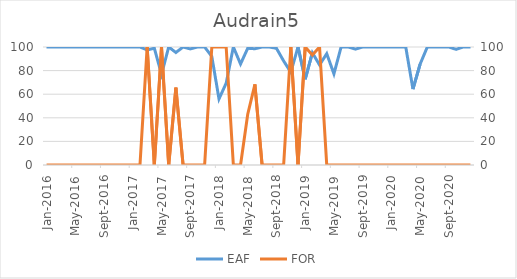
| Category | EAF |
|---|---|
| 2016-01-01 | 100 |
| 2016-02-01 | 100 |
| 2016-03-01 | 100 |
| 2016-04-01 | 100 |
| 2016-05-01 | 100 |
| 2016-06-01 | 100 |
| 2016-07-01 | 100 |
| 2016-08-01 | 100 |
| 2016-09-01 | 100 |
| 2016-10-01 | 100 |
| 2016-11-01 | 100 |
| 2016-12-01 | 100 |
| 2017-01-01 | 100 |
| 2017-02-01 | 100 |
| 2017-03-01 | 97.51 |
| 2017-04-01 | 98.96 |
| 2017-05-01 | 76.78 |
| 2017-06-01 | 100 |
| 2017-07-01 | 95.34 |
| 2017-08-01 | 100 |
| 2017-09-01 | 98.37 |
| 2017-10-01 | 100 |
| 2017-11-01 | 100 |
| 2017-12-01 | 92 |
| 2018-01-01 | 55.98 |
| 2018-02-01 | 69.35 |
| 2018-03-01 | 100 |
| 2018-04-01 | 85.6 |
| 2018-05-01 | 98.92 |
| 2018-06-01 | 98.52 |
| 2018-07-01 | 100 |
| 2018-08-01 | 100 |
| 2018-09-01 | 98.89 |
| 2018-10-01 | 88.16 |
| 2018-11-01 | 78.6 |
| 2018-12-01 | 100 |
| 2019-01-01 | 72.65 |
| 2019-02-01 | 95.09 |
| 2019-03-01 | 84.79 |
| 2019-04-01 | 94.31 |
| 2019-05-01 | 77.23 |
| 2019-06-01 | 100 |
| 2019-07-01 | 100 |
| 2019-08-01 | 98.21 |
| 2019-09-01 | 100 |
| 2019-10-01 | 100 |
| 2019-11-01 | 100 |
| 2019-12-01 | 100 |
| 2020-01-01 | 100 |
| 2020-02-01 | 100 |
| 2020-03-01 | 100 |
| 2020-04-01 | 64.31 |
| 2020-05-01 | 85.49 |
| 2020-06-01 | 100 |
| 2020-07-01 | 100 |
| 2020-08-01 | 100 |
| 2020-09-01 | 100 |
| 2020-10-01 | 98.02 |
| 2020-11-01 | 100 |
| 2020-12-01 | 100 |